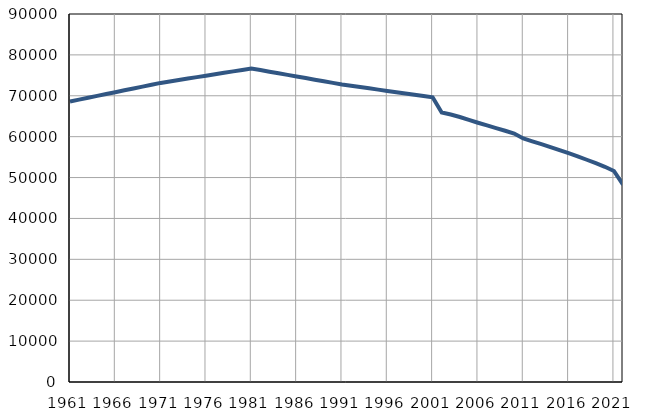
| Category | Број
становника |
|---|---|
| 1961.0 | 68616 |
| 1962.0 | 69068 |
| 1963.0 | 69522 |
| 1964.0 | 69975 |
| 1965.0 | 70428 |
| 1966.0 | 70881 |
| 1967.0 | 71335 |
| 1968.0 | 71787 |
| 1969.0 | 72241 |
| 1970.0 | 72694 |
| 1971.0 | 73147 |
| 1972.0 | 73500 |
| 1973.0 | 73854 |
| 1974.0 | 74207 |
| 1975.0 | 74560 |
| 1976.0 | 74913 |
| 1977.0 | 75267 |
| 1978.0 | 75621 |
| 1979.0 | 75974 |
| 1980.0 | 76328 |
| 1981.0 | 76681 |
| 1982.0 | 76289 |
| 1983.0 | 75897 |
| 1984.0 | 75506 |
| 1985.0 | 75114 |
| 1986.0 | 74722 |
| 1987.0 | 74330 |
| 1988.0 | 73938 |
| 1989.0 | 73547 |
| 1990.0 | 73155 |
| 1991.0 | 72763 |
| 1992.0 | 72449 |
| 1993.0 | 72134 |
| 1994.0 | 71822 |
| 1995.0 | 71507 |
| 1996.0 | 71194 |
| 1997.0 | 70880 |
| 1998.0 | 70566 |
| 1999.0 | 70252 |
| 2000.0 | 69938 |
| 2001.0 | 69624 |
| 2002.0 | 65923 |
| 2003.0 | 65407 |
| 2004.0 | 64809 |
| 2005.0 | 64100 |
| 2006.0 | 63398 |
| 2007.0 | 62743 |
| 2008.0 | 62106 |
| 2009.0 | 61446 |
| 2010.0 | 60756 |
| 2011.0 | 59578 |
| 2012.0 | 58856 |
| 2013.0 | 58183 |
| 2014.0 | 57457 |
| 2015.0 | 56714 |
| 2016.0 | 55987 |
| 2017.0 | 55205 |
| 2018.0 | 54355 |
| 2019.0 | 53509 |
| 2020.0 | 52637 |
| 2021.0 | 51607 |
| 2022.0 | 48262 |